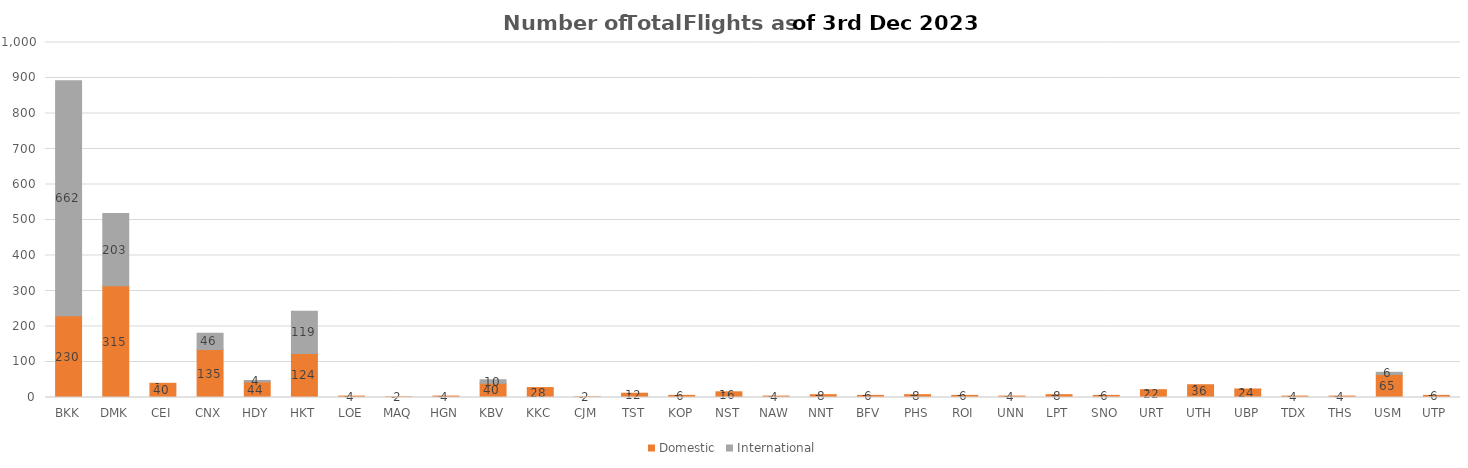
| Category | Domestic | International |
|---|---|---|
| BKK | 230 | 662 |
| DMK | 315 | 203 |
| CEI | 40 | 0 |
| CNX | 135 | 46 |
| HDY | 44 | 4 |
| HKT | 124 | 119 |
| LOE | 4 | 0 |
| MAQ | 2 | 0 |
| HGN | 4 | 0 |
| KBV | 40 | 10 |
| KKC | 28 | 0 |
| CJM | 2 | 0 |
| TST | 12 | 0 |
| KOP | 6 | 0 |
| NST | 16 | 0 |
| NAW | 4 | 0 |
| NNT | 8 | 0 |
| BFV | 6 | 0 |
| PHS | 8 | 0 |
| ROI | 6 | 0 |
| UNN | 4 | 0 |
| LPT | 8 | 0 |
| SNO | 6 | 0 |
| URT | 22 | 0 |
| UTH | 36 | 0 |
| UBP | 24 | 0 |
| TDX | 4 | 0 |
| THS | 4 | 0 |
| USM | 65 | 6 |
| UTP | 6 | 0 |